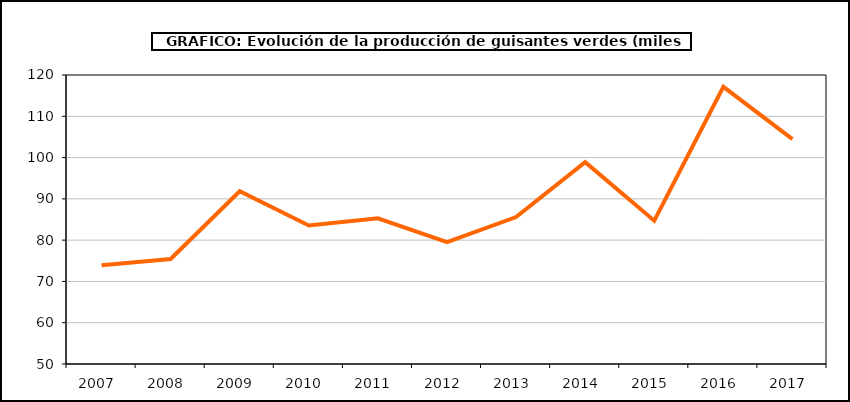
| Category | producción |
|---|---|
| 2007.0 | 73.937 |
| 2008.0 | 75.438 |
| 2009.0 | 91.847 |
| 2010.0 | 83.53 |
| 2011.0 | 85.3 |
| 2012.0 | 79.511 |
| 2013.0 | 85.601 |
| 2014.0 | 98.878 |
| 2015.0 | 84.705 |
| 2016.0 | 117.126 |
| 2017.0 | 104.472 |